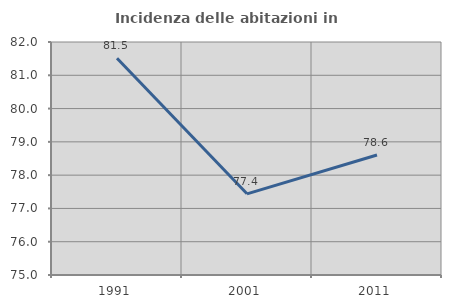
| Category | Incidenza delle abitazioni in proprietà  |
|---|---|
| 1991.0 | 81.513 |
| 2001.0 | 77.439 |
| 2011.0 | 78.605 |